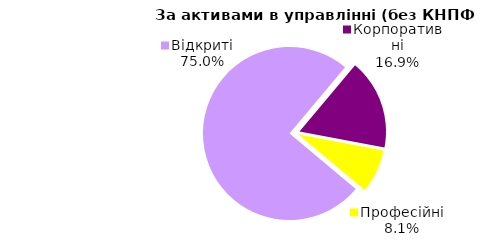
| Category | Series 0 |
|---|---|
| Відкриті | 1354.582 |
| Корпоративні | 304.857 |
| Професійні | 146.879 |